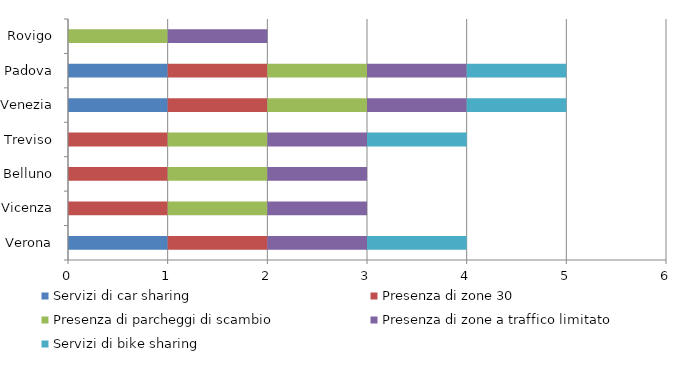
| Category | Servizi di car sharing | Presenza di zone 30 | Presenza di parcheggi di scambio | Presenza di zone a traffico limitato | Servizi di bike sharing |
|---|---|---|---|---|---|
| Verona | 1 | 1 | 0 | 1 | 1 |
| Vicenza | 0 | 1 | 1 | 1 | 0 |
| Belluno | 0 | 1 | 1 | 1 | 0 |
| Treviso | 0 | 1 | 1 | 1 | 1 |
| Venezia | 1 | 1 | 1 | 1 | 1 |
| Padova | 1 | 1 | 1 | 1 | 1 |
| Rovigo | 0 | 0 | 1 | 1 | 0 |